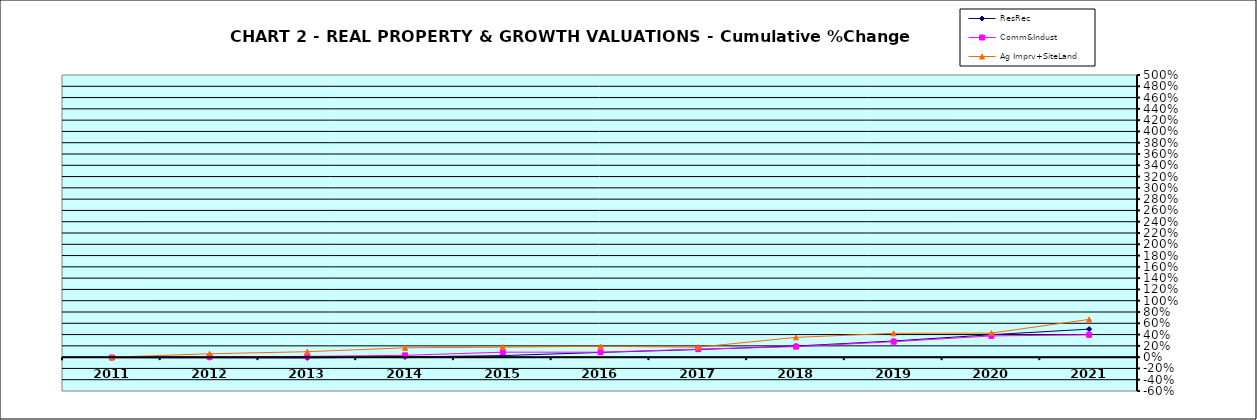
| Category | ResRec | Comm&Indust | Ag Imprv+SiteLand |
|---|---|---|---|
| 2011.0 | -0.01 | -0.007 | 0 |
| 2012.0 | -0.011 | 0.005 | 0.059 |
| 2013.0 | -0.013 | 0.014 | 0.097 |
| 2014.0 | 0.004 | 0.032 | 0.165 |
| 2015.0 | 0.027 | 0.088 | 0.179 |
| 2016.0 | 0.083 | 0.088 | 0.191 |
| 2017.0 | 0.135 | 0.141 | 0.177 |
| 2018.0 | 0.197 | 0.186 | 0.351 |
| 2019.0 | 0.286 | 0.274 | 0.423 |
| 2020.0 | 0.398 | 0.376 | 0.426 |
| 2021.0 | 0.497 | 0.395 | 0.669 |